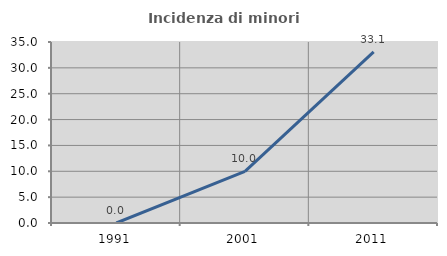
| Category | Incidenza di minori stranieri |
|---|---|
| 1991.0 | 0 |
| 2001.0 | 10 |
| 2011.0 | 33.083 |